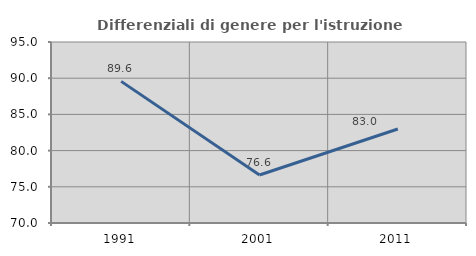
| Category | Differenziali di genere per l'istruzione superiore |
|---|---|
| 1991.0 | 89.561 |
| 2001.0 | 76.636 |
| 2011.0 | 82.985 |